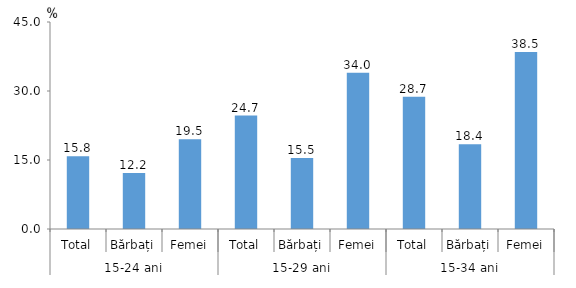
| Category | Series 0 |
|---|---|
| 0 | 15.805 |
| 1 | 12.193 |
| 2 | 19.534 |
| 3 | 24.664 |
| 4 | 15.455 |
| 5 | 33.954 |
| 6 | 28.746 |
| 7 | 18.445 |
| 8 | 38.498 |